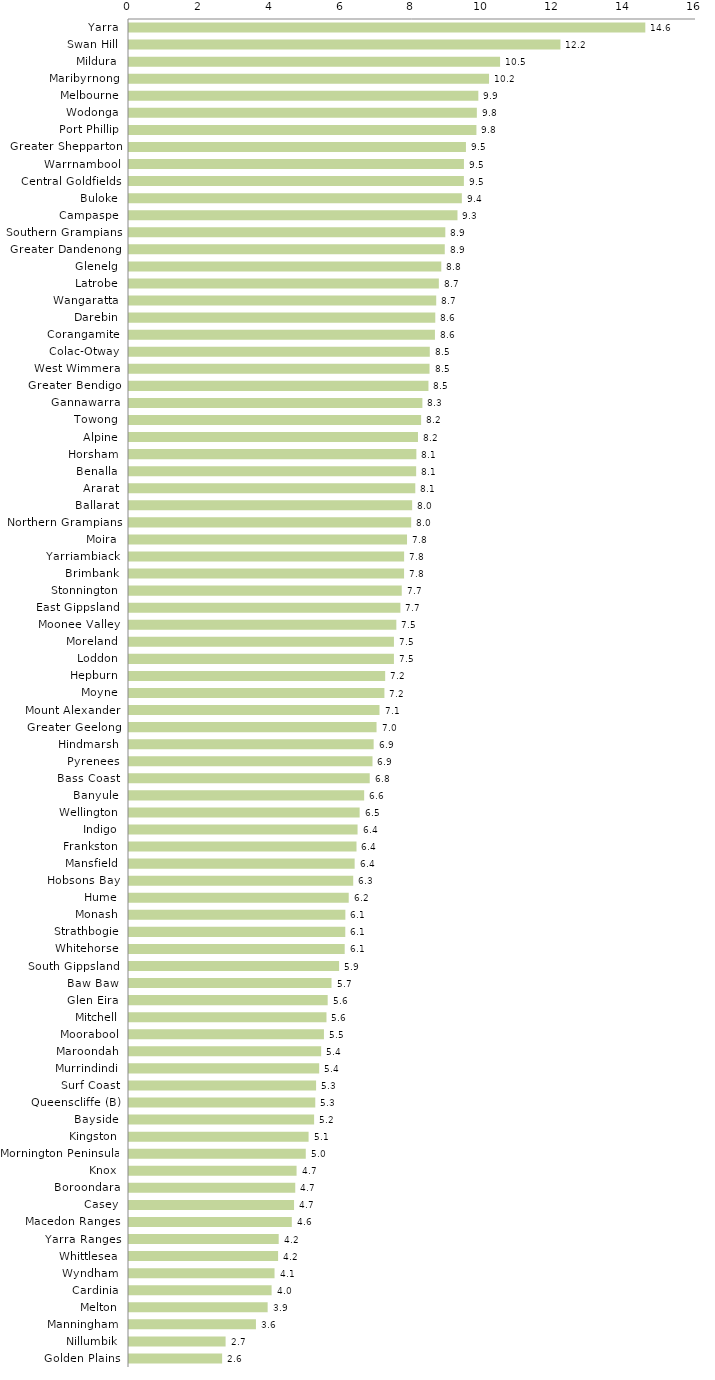
| Category | Series 0 |
|---|---|
| Yarra | 14.57 |
| Swan Hill | 12.175 |
| Mildura | 10.471 |
| Maribyrnong | 10.16 |
| Melbourne | 9.858 |
| Wodonga | 9.816 |
| Port Phillip | 9.804 |
| Greater Shepparton | 9.508 |
| Warrnambool | 9.452 |
| Central Goldfields | 9.45 |
| Buloke | 9.392 |
| Campaspe | 9.269 |
| Southern Grampians | 8.926 |
| Greater Dandenong | 8.911 |
| Glenelg | 8.812 |
| Latrobe | 8.743 |
| Wangaratta | 8.669 |
| Darebin | 8.643 |
| Corangamite | 8.633 |
| Colac-Otway | 8.488 |
| West Wimmera | 8.481 |
| Greater Bendigo | 8.45 |
| Gannawarra | 8.279 |
| Towong | 8.243 |
| Alpine | 8.155 |
| Horsham | 8.109 |
| Benalla | 8.103 |
| Ararat | 8.079 |
| Ballarat | 7.99 |
| Northern Grampians | 7.963 |
| Moira | 7.845 |
| Yarriambiack | 7.763 |
| Brimbank | 7.762 |
| Stonnington | 7.697 |
| East Gippsland | 7.658 |
| Moonee Valley | 7.544 |
| Moreland | 7.476 |
| Loddon | 7.476 |
| Hepburn | 7.229 |
| Moyne | 7.207 |
| Mount Alexander | 7.069 |
| Greater Geelong | 6.985 |
| Hindmarsh | 6.904 |
| Pyrenees | 6.871 |
| Bass Coast | 6.793 |
| Banyule | 6.636 |
| Wellington | 6.508 |
| Indigo | 6.45 |
| Frankston | 6.42 |
| Mansfield | 6.367 |
| Hobsons Bay | 6.327 |
| Hume | 6.2 |
| Monash | 6.106 |
| Strathbogie | 6.103 |
| Whitehorse | 6.087 |
| South Gippsland | 5.929 |
| Baw Baw | 5.715 |
| Glen Eira | 5.606 |
| Mitchell | 5.572 |
| Moorabool | 5.501 |
| Maroondah | 5.422 |
| Murrindindi | 5.367 |
| Surf Coast | 5.279 |
| Queenscliffe (B) | 5.256 |
| Bayside | 5.224 |
| Kingston | 5.068 |
| Mornington Peninsula | 4.988 |
| Knox | 4.729 |
| Boroondara | 4.691 |
| Casey | 4.657 |
| Macedon Ranges | 4.594 |
| Yarra Ranges | 4.224 |
| Whittlesea | 4.207 |
| Wyndham | 4.107 |
| Cardinia | 4.024 |
| Melton | 3.912 |
| Manningham | 3.582 |
| Nillumbik | 2.726 |
| Golden Plains | 2.628 |